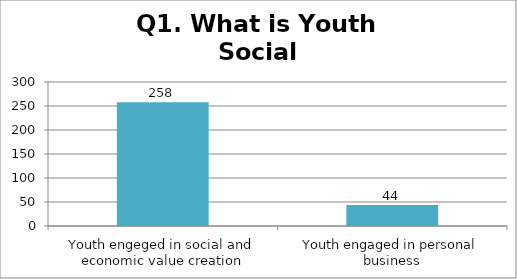
| Category | Q1. What is Youth Social Entrepreneurship? |
|---|---|
| Youth engeged in social and economic value creation | 258 |
| Youth engaged in personal business | 44 |